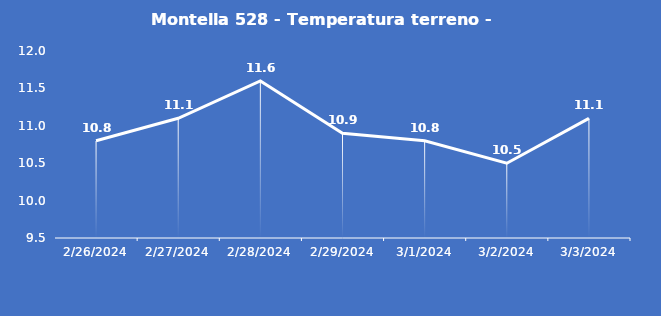
| Category | Montella 528 - Temperatura terreno - Grezzo (°C) |
|---|---|
| 2/26/24 | 10.8 |
| 2/27/24 | 11.1 |
| 2/28/24 | 11.6 |
| 2/29/24 | 10.9 |
| 3/1/24 | 10.8 |
| 3/2/24 | 10.5 |
| 3/3/24 | 11.1 |